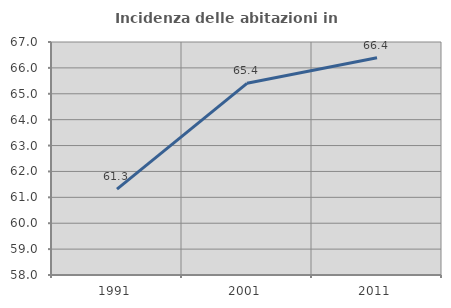
| Category | Incidenza delle abitazioni in proprietà  |
|---|---|
| 1991.0 | 61.316 |
| 2001.0 | 65.404 |
| 2011.0 | 66.39 |